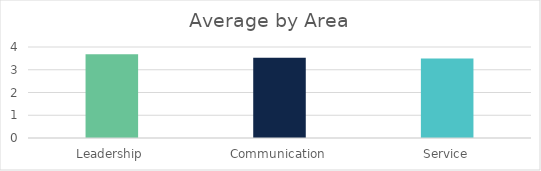
| Category | Series 0 |
|---|---|
| Leadership | 3.68 |
| Communication | 3.53 |
| Service | 3.5 |